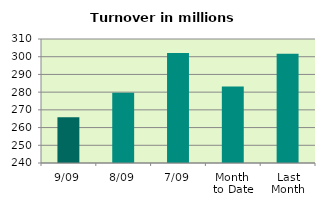
| Category | Series 0 |
|---|---|
| 9/09 | 265.757 |
| 8/09 | 279.629 |
| 7/09 | 302.09 |
| Month 
to Date | 283.252 |
| Last
Month | 301.741 |